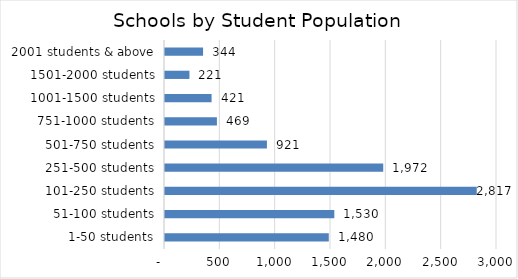
| Category | Series 0 |
|---|---|
| 1-50 students | 1480 |
| 51-100 students | 1530 |
| 101-250 students | 2817 |
| 251-500 students | 1972 |
| 501-750 students | 921 |
| 751-1000 students | 469 |
| 1001-1500 students | 421 |
| 1501-2000 students | 221 |
| 2001 students & above | 344 |